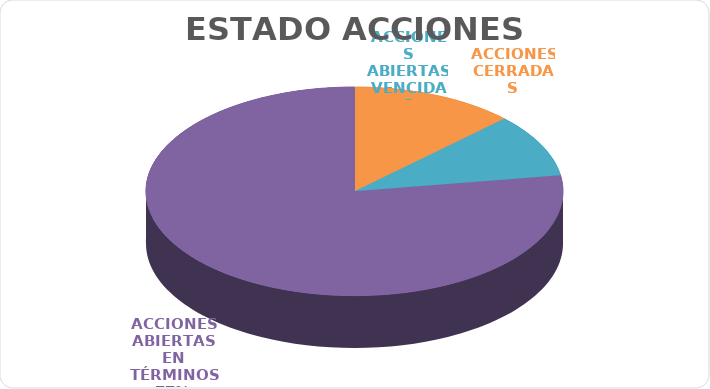
| Category | Series 0 |
|---|---|
| ACCIONES CERRADAS | 13 |
| ACCIONES ABIERTAS VENCIDAS | 10 |
| ACCIONES ABIERTAS EN TÉRMINOS | 79 |